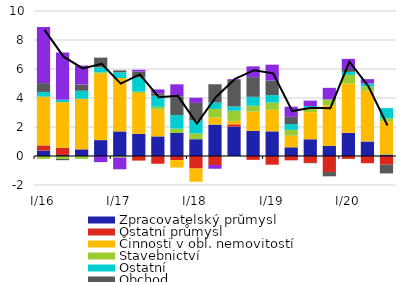
| Category | Zpracovatelský průmysl | Ostatní průmysl | Činnosti v obl. nemovitostí | Stavebnictví | Ostatní | Obchod | Služby  |
|---|---|---|---|---|---|---|---|
| I/16 | 0.372 | 0.362 | 3.359 | -0.2 | 0.325 | 0.608 | 3.869 |
| II | 0.072 | 0.502 | 3.138 | -0.2 | 0.17 | -0.089 | 3.256 |
| III | 0.454 | 0.013 | 3.483 | -0.2 | 0.549 | 0.432 | 1.308 |
| IV | 1.093 | 0.006 | 4.578 | 0.1 | 0.338 | 0.669 | -0.424 |
| I/17 | 1.697 | -0.007 | 3.685 | -0.1 | 0.393 | 0.129 | -0.807 |
| II | 1.525 | -0.317 | 2.819 | 0.1 | 0.964 | 0.413 | 0.125 |
| III | 1.353 | -0.534 | 1.841 | 0.2 | 0.758 | 0.173 | 0.267 |
| IV | 1.588 | -0.285 | -0.51 | 0.3 | 0.934 | 1.291 | 0.831 |
| I/18 | 1.158 | -0.865 | -0.911 | 0.4 | 0.888 | 1.216 | 0.357 |
| II | 2.167 | -0.624 | 0.481 | 0.6 | 0.442 | 1.258 | -0.254 |
| III | 2.025 | 0.159 | 0.235 | 0.7 | 0.299 | 1.841 | 0.054 |
| IV | 1.724 | -0.266 | 1.343 | 0.4 | 0.615 | 1.358 | 0.742 |
| I/19 | 1.7 | -0.6 | 1.481 | 0.5 | 0.519 | 1 | 1.1 |
| II | 0.6 | -0.3 | 0.8 | 0.4 | 0.4 | 0.5 | 0.7 |
| III | 1.154 | -0.475 | 1.869 | 0.244 | 0.181 | -0.024 | 0.372 |
| IV | 0.7 | -1.1 | 2.8 | 0.4 | 0 | -0.3 | 0.8 |
| I/20 | 1.6 | -0.2 | 3.4 | 0.6 | 0.2 | 0.2 | 0.7 |
| II | 1 | -0.5 | 3.5 | 0.3 | 0.2 | 0 | 0.3 |
| III | 0.1 | -0.6 | 2.3 | 0.2 | 0.7 | -0.6 | 0 |